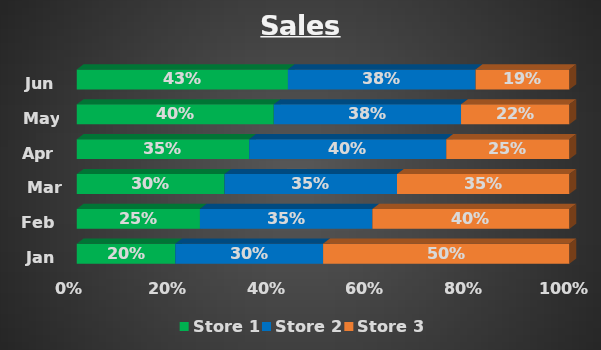
| Category | Store 1 | Store 2 | Store 3 |
|---|---|---|---|
| Jan | 0.2 | 0.3 | 0.5 |
| Feb | 0.25 | 0.35 | 0.4 |
| Mar | 0.3 | 0.35 | 0.35 |
| Apr | 0.35 | 0.4 | 0.25 |
| May | 0.4 | 0.38 | 0.22 |
| Jun | 0.429 | 0.381 | 0.19 |